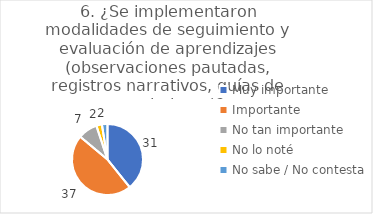
| Category | 6. ¿Se implementaron modalidades de seguimiento y evaluación de aprendizajes (observaciones pautadas, registros narrativos, guías de seguimiento)? |
|---|---|
| Muy importante  | 0.392 |
| Importante  | 0.468 |
| No tan importante  | 0.089 |
| No lo noté  | 0.025 |
| No sabe / No contesta | 0.025 |